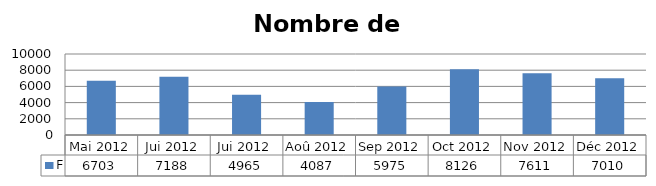
| Category | F |
|---|---|
| Mai 2012 | 6703 |
| Jui 2012 | 7188 |
| Jui 2012 | 4965 |
| Aoû 2012 | 4087 |
| Sep 2012 | 5975 |
| Oct 2012 | 8126 |
| Nov 2012 | 7611 |
| Déc 2012 | 7010 |